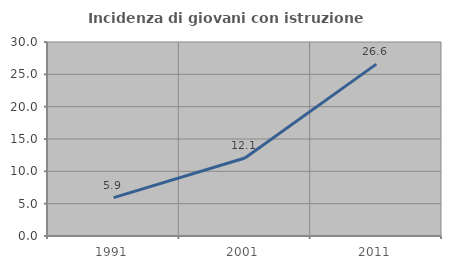
| Category | Incidenza di giovani con istruzione universitaria |
|---|---|
| 1991.0 | 5.932 |
| 2001.0 | 12.069 |
| 2011.0 | 26.582 |